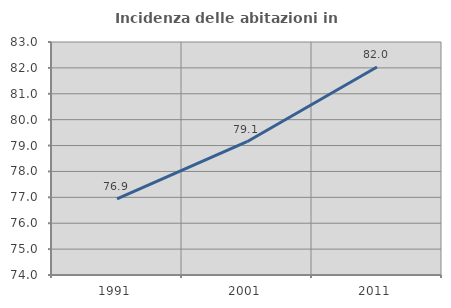
| Category | Incidenza delle abitazioni in proprietà  |
|---|---|
| 1991.0 | 76.94 |
| 2001.0 | 79.148 |
| 2011.0 | 82.035 |